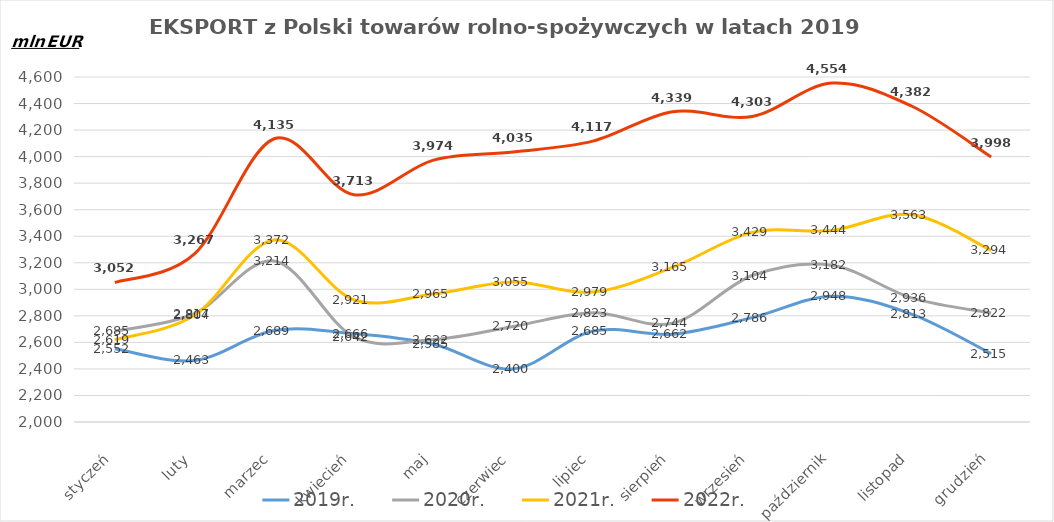
| Category | 2019r. | 2020r. | 2021r. | 2022r. |
|---|---|---|---|---|
| styczeń | 2552.041 | 2684.881 | 2619.224 | 3051.504 |
| luty | 2463.491 | 2816.651 | 2803.716 | 3267.083 |
| marzec | 2689.048 | 3214.124 | 3372.15 | 4134.687 |
| kwiecień | 2666.157 | 2642.009 | 2921.348 | 3713.073 |
| maj | 2585.354 | 2621.695 | 2964.67 | 3973.764 |
| czerwiec | 2399.927 | 2720.089 | 3055.251 | 4035.261 |
| lipiec | 2684.871 | 2823.379 | 2979.009 | 4116.563 |
| sierpień | 2661.93 | 2744.182 | 3164.77 | 4338.569 |
| wrzesień | 2786.361 | 3103.827 | 3429.316 | 4302.562 |
| październik | 2948.145 | 3181.86 | 3443.979 | 4554.289 |
| listopad | 2813.189 | 2935.595 | 3563.158 | 4381.502 |
| grudzień | 2515.083 | 2821.61 | 3293.914 | 3997.711 |